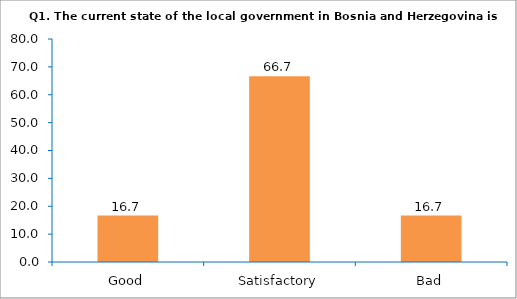
| Category | Series 0 |
|---|---|
| Good | 16.667 |
| Satisfactory | 66.667 |
| Bad | 16.667 |